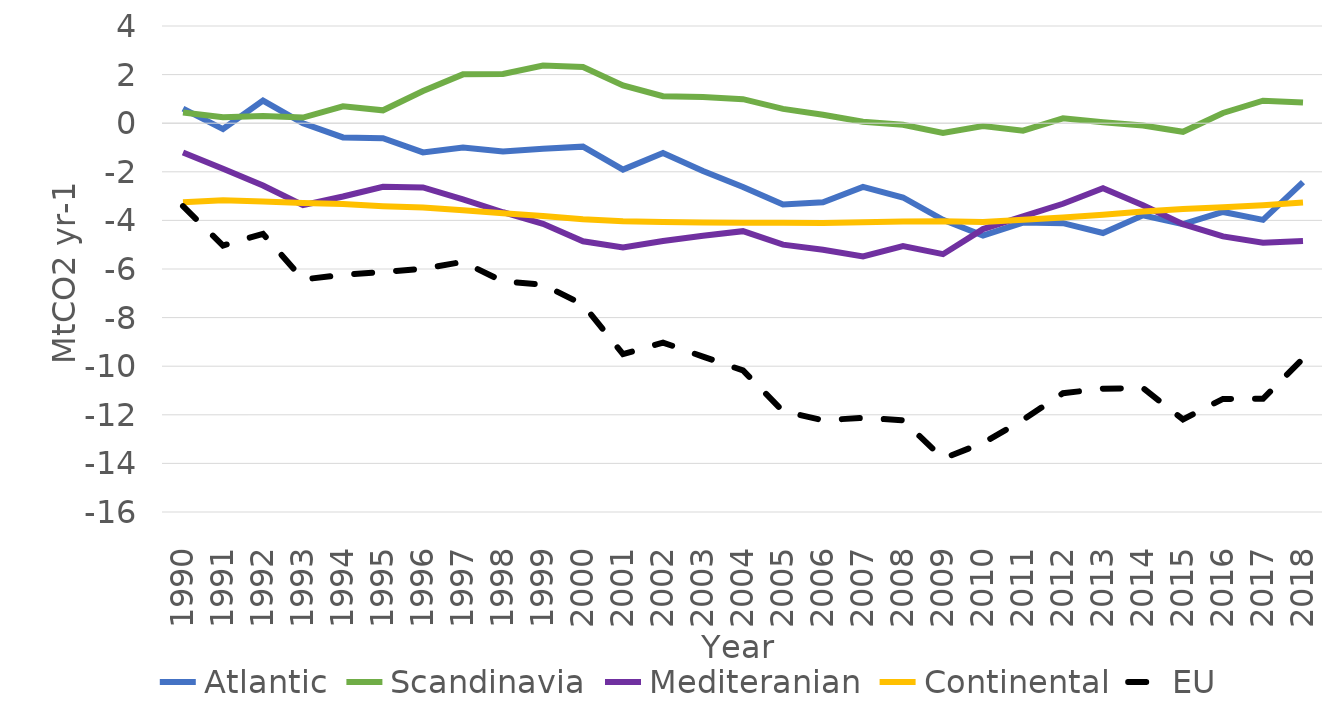
| Category | Atlantic | Scandinavia | Mediteranian | Continental | EU |
|---|---|---|---|---|---|
| 1990 | 0.599 | 0.439 | -1.204 | -3.248 | -3.414 |
| 1991 | -0.241 | 0.245 | -1.872 | -3.167 | -5.035 |
| 1992 | 0.93 | 0.301 | -2.563 | -3.22 | -4.552 |
| 1993 | -0.003 | 0.231 | -3.373 | -3.286 | -6.431 |
| 1994 | -0.585 | 0.693 | -3.017 | -3.328 | -6.237 |
| 1995 | -0.617 | 0.53 | -2.62 | -3.413 | -6.12 |
| 1996 | -1.2 | 1.323 | -2.643 | -3.47 | -5.99 |
| 1997 | -1.002 | 2.01 | -3.131 | -3.582 | -5.706 |
| 1998 | -1.169 | 2.028 | -3.665 | -3.709 | -6.515 |
| 1999 | -1.053 | 2.375 | -4.142 | -3.821 | -6.641 |
| 2000 | -0.965 | 2.31 | -4.859 | -3.952 | -7.466 |
| 2001 | -1.91 | 1.551 | -5.114 | -4.03 | -9.503 |
| 2002 | -1.225 | 1.109 | -4.847 | -4.065 | -9.028 |
| 2003 | -1.966 | 1.08 | -4.634 | -4.085 | -9.605 |
| 2004 | -2.622 | 0.99 | -4.443 | -4.1 | -10.175 |
| 2005 | -3.349 | 0.59 | -4.998 | -4.094 | -11.852 |
| 2006 | -3.255 | 0.346 | -5.207 | -4.108 | -12.223 |
| 2007 | -2.622 | 0.057 | -5.486 | -4.075 | -12.127 |
| 2008 | -3.057 | -0.062 | -5.06 | -4.044 | -12.223 |
| 2009 | -3.975 | -0.402 | -5.39 | -4.035 | -13.802 |
| 2010 | -4.621 | -0.115 | -4.358 | -4.064 | -13.159 |
| 2011 | -4.087 | -0.306 | -3.839 | -3.978 | -12.209 |
| 2012 | -4.112 | 0.203 | -3.315 | -3.885 | -11.109 |
| 2013 | -4.518 | 0.036 | -2.676 | -3.765 | -10.924 |
| 2014 | -3.791 | -0.099 | -3.377 | -3.633 | -10.9 |
| 2015 | -4.155 | -0.353 | -4.152 | -3.531 | -12.19 |
| 2016 | -3.652 | 0.421 | -4.659 | -3.455 | -11.345 |
| 2017 | -3.976 | 0.927 | -4.922 | -3.372 | -11.344 |
| 2018 | -2.423 | 0.853 | -4.852 | -3.265 | -9.687 |